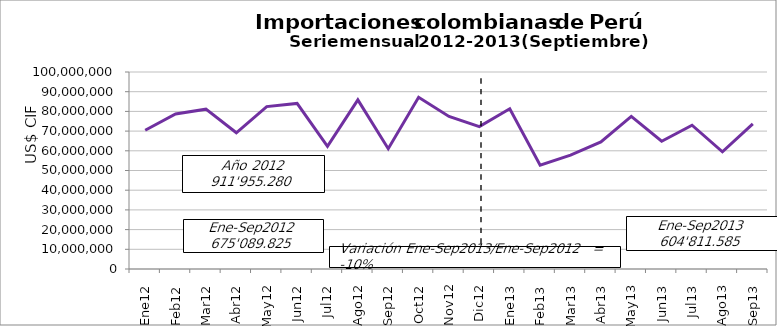
| Category | Series 0 |
|---|---|
| 0 | 70439763.44 |
| 1 | 78687730.14 |
| 2 | 81143593.22 |
| 3 | 69154596.53 |
| 4 | 82437041.95 |
| 5 | 84040996.35 |
| 6 | 62244445.53 |
| 7 | 85861091.01 |
| 8 | 61080567.3 |
| 9 | 87158518.21 |
| 10 | 77439641.32 |
| 11 | 72267294.75 |
| 12 | 81356817.28 |
| 13 | 52741841.18 |
| 14 | 57784438.02 |
| 15 | 64473632.95 |
| 16 | 77472625.51 |
| 17 | 64854657.41 |
| 18 | 72975757.38 |
| 19 | 59478193.69 |
| 20 | 73673621.2 |